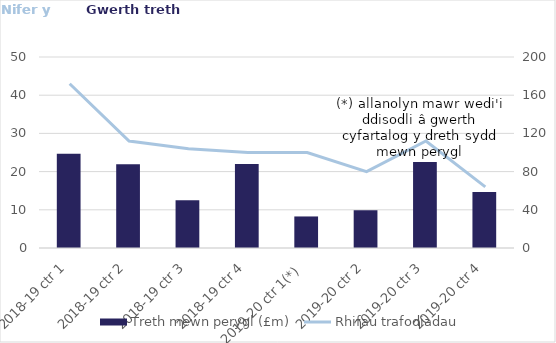
| Category | Treth mewn perygl (£m) |
|---|---|
| 2018-19 ctr 1 | 98760.52 |
| 2018-19 ctr 2 | 87729.78 |
| 2018-19 ctr 3 | 50032.67 |
| 2018-19 ctr 4 | 87898.41 |
| 2019-20 ctr 1(*) | 33034.11 |
| 2019-20 ctr 2 | 39550.25 |
| 2019-20 ctr 3 | 89990.5 |
| 2019-20 ctr 4 | 58595 |